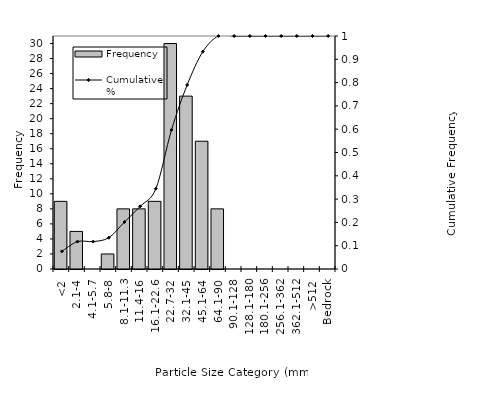
| Category | Frequency |
|---|---|
| <2 | 9 |
| 2.1-4 | 5 |
| 4.1-5.7 | 0 |
| 5.8-8 | 2 |
| 8.1-11.3 | 8 |
| 11.4-16 | 8 |
| 16.1-22.6 | 9 |
| 22.7-32 | 30 |
| 32.1-45 | 23 |
| 45.1-64 | 17 |
| 64.1-90 | 8 |
| 90.1-128 | 0 |
| 128.1-180 | 0 |
| 180.1-256 | 0 |
| 256.1-362 | 0 |
| 362.1-512 | 0 |
| >512 | 0 |
| Bedrock | 0 |